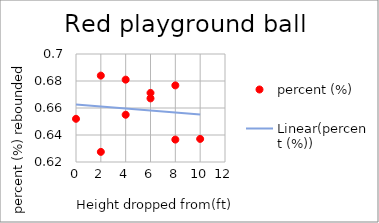
| Category | percent (%) |
|---|---|
| 10.0 | 0.637 |
| 8.0 | 0.637 |
| 8.0 | 0.677 |
| 6.0 | 0.667 |
| 6.0 | 0.671 |
| 4.0 | 0.655 |
| 4.0 | 0.681 |
| 2.0 | 0.684 |
| 2.0 | 0.628 |